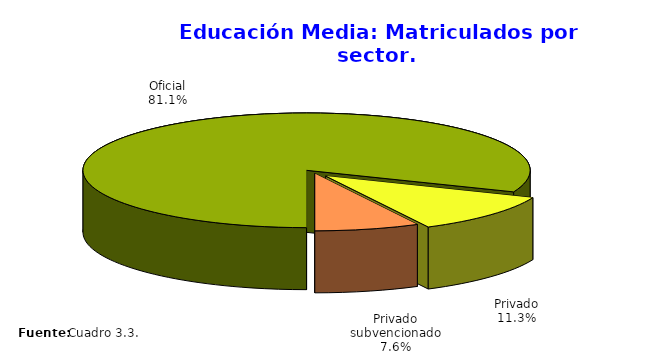
| Category | Series 0 |
|---|---|
| Oficial | 212683 |
| Privado | 29565 |
| Privado subvencionado | 19883 |